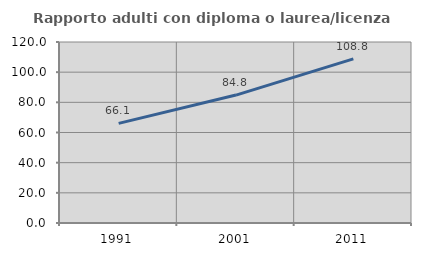
| Category | Rapporto adulti con diploma o laurea/licenza media  |
|---|---|
| 1991.0 | 66.057 |
| 2001.0 | 84.818 |
| 2011.0 | 108.82 |